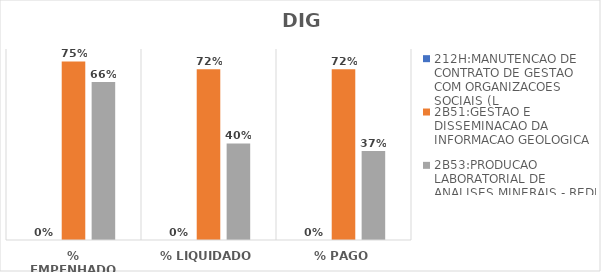
| Category | 212H:MANUTENCAO DE CONTRATO DE GESTAO COM ORGANIZACOES SOCIAIS (L | 2B51:GESTAO E DISSEMINACAO DA INFORMACAO GEOLOGICA | 2B53:PRODUCAO LABORATORIAL DE ANALISES MINERAIS - REDE LAMIN |
|---|---|---|---|
| % EMPENHADO | 0 | 0.748 | 0.662 |
| % LIQUIDADO | 0 | 0.715 | 0.404 |
| % PAGO | 0 | 0.715 | 0.373 |